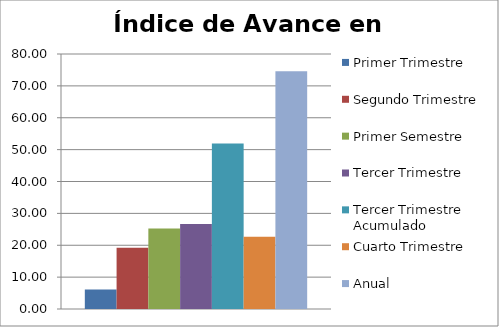
| Category | Primer Trimestre | Segundo Trimestre | Primer Semestre | Tercer Trimestre | Tercer Trimestre Acumulado | Cuarto Trimestre | Anual |
|---|---|---|---|---|---|---|---|
| 0 | 6.096 | 19.198 | 25.294 | 26.63 | 51.924 | 22.691 | 74.615 |